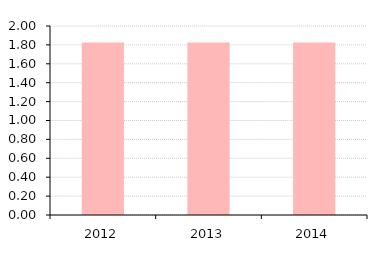
| Category | Avg. Collection Period |
|---|---|
| 2012.0 | 1.825 |
| 2013.0 | 1.825 |
| 2014.0 | 1.825 |